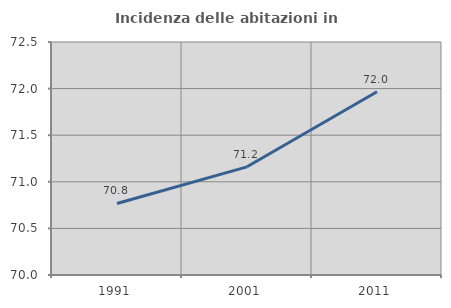
| Category | Incidenza delle abitazioni in proprietà  |
|---|---|
| 1991.0 | 70.768 |
| 2001.0 | 71.161 |
| 2011.0 | 71.967 |